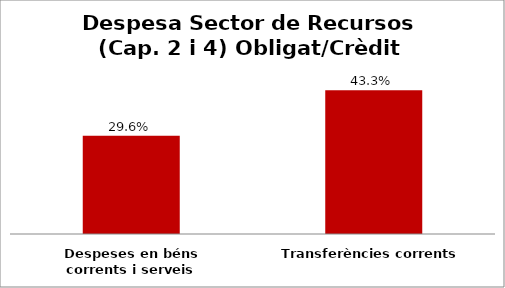
| Category | Series 0 |
|---|---|
| Despeses en béns corrents i serveis | 0.296 |
| Transferències corrents | 0.433 |